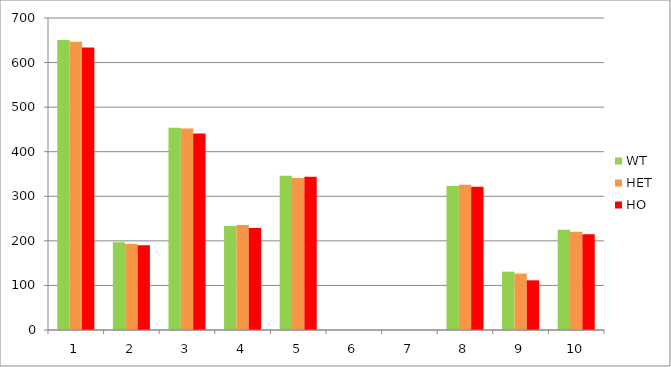
| Category | WT | HET | HO |
|---|---|---|---|
| 1.0 | 650.909 | 646.659 | 633.85 |
| 2.0 | 197.091 | 193.214 | 189.955 |
| 3.0 | 453.818 | 452.244 | 440.85 |
| 4.0 | 233.545 | 235.643 | 228.955 |
| 5.0 | 346.136 | 341.119 | 343.667 |
| 6.0 | 0 | 0 | 0 |
| 7.0 | 0 | 0 | 0 |
| 8.0 | 323.136 | 326 | 321.318 |
| 9.0 | 130.87 | 126.644 | 111.462 |
| 10.0 | 225.13 | 220.556 | 215.04 |